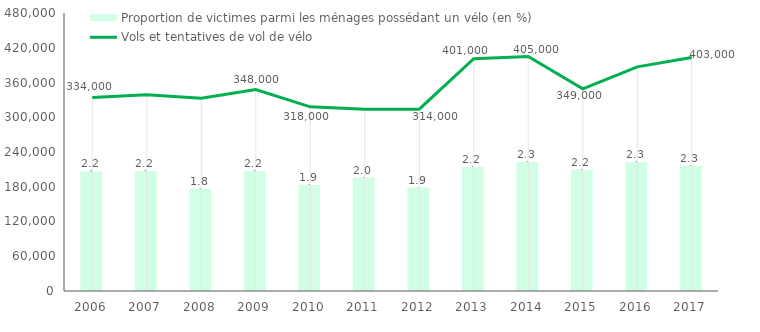
| Category | Proportion de victimes parmi les ménages possédant un vélo (en %) |
|---|---|
| 2006.0 | 2.151 |
| 2007.0 | 2.152 |
| 2008.0 | 1.837 |
| 2009.0 | 2.156 |
| 2010.0 | 1.905 |
| 2011.0 | 2.04 |
| 2012.0 | 1.861 |
| 2013.0 | 2.232 |
| 2014.0 | 2.319 |
| 2015.0 | 2.179 |
| 2016.0 | 2.317 |
| 2017.0 | 2.252 |